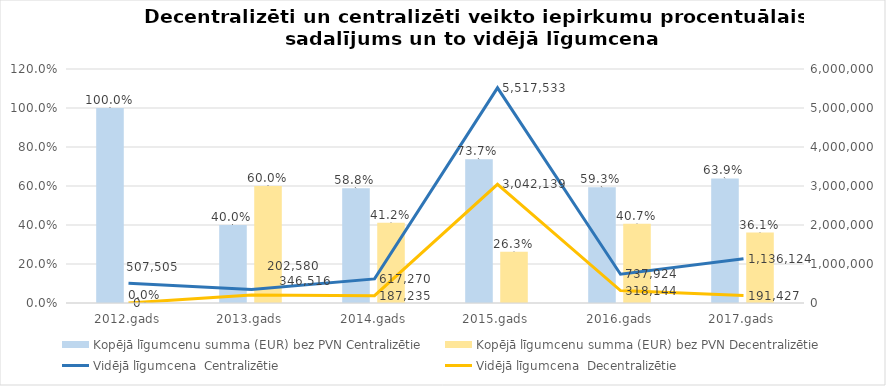
| Category | Kopējā līgumcenu summa (EUR) bez PVN |
|---|---|
| 2012.gads | 0 |
| 2013.gads | 0.6 |
| 2014.gads | 0.412 |
| 2015.gads | 0.263 |
| 2016.gads | 0.407 |
| 2017.gads | 0.361 |